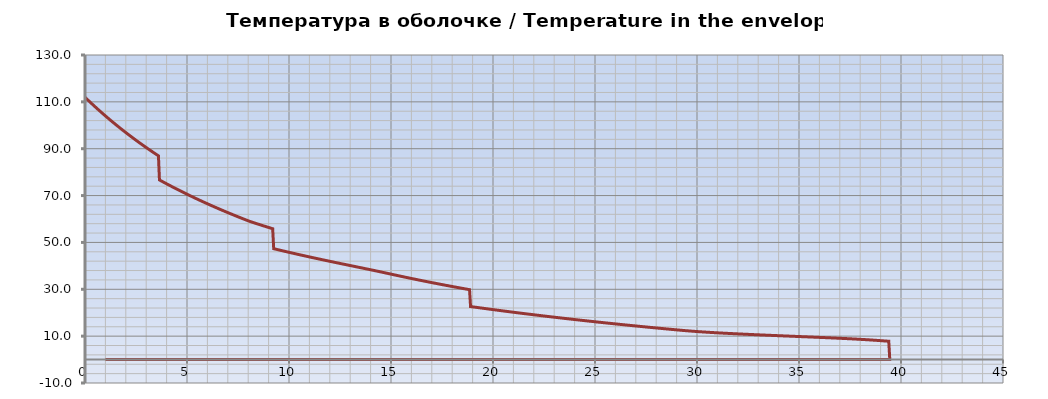
| Category | Температура в оболочке / Temperature in the envelope tв [C] |
|---|---|
| 0.0 | 111.962 |
| 0.05 | 111.542 |
| 0.1 | 111.124 |
| 0.15000000000000002 | 110.708 |
| 0.2 | 110.295 |
| 0.25 | 109.885 |
| 0.3 | 109.477 |
| 0.35 | 109.071 |
| 0.39999999999999997 | 108.668 |
| 0.44999999999999996 | 108.267 |
| 0.49999999999999994 | 107.868 |
| 0.5499999999999999 | 107.472 |
| 0.6 | 107.078 |
| 0.65 | 106.686 |
| 0.7000000000000001 | 106.297 |
| 0.7500000000000001 | 105.91 |
| 0.8000000000000002 | 105.525 |
| 0.8500000000000002 | 105.142 |
| 0.9000000000000002 | 104.761 |
| 0.9500000000000003 | 104.382 |
| 1.0000000000000002 | 104.006 |
| 1.0500000000000003 | 103.632 |
| 1.1000000000000003 | 103.26 |
| 1.1500000000000004 | 102.889 |
| 1.2000000000000004 | 102.521 |
| 1.2500000000000004 | 102.155 |
| 1.3000000000000005 | 101.791 |
| 1.3500000000000005 | 101.429 |
| 1.4000000000000006 | 101.069 |
| 1.4500000000000006 | 100.711 |
| 1.5000000000000007 | 100.355 |
| 1.5500000000000007 | 100.001 |
| 1.6000000000000008 | 99.649 |
| 1.6500000000000008 | 99.299 |
| 1.7000000000000008 | 98.95 |
| 1.7500000000000009 | 98.604 |
| 1.800000000000001 | 98.259 |
| 1.850000000000001 | 97.916 |
| 1.900000000000001 | 97.575 |
| 1.950000000000001 | 97.236 |
| 2.000000000000001 | 96.899 |
| 2.0500000000000007 | 96.563 |
| 2.1000000000000005 | 96.229 |
| 2.1500000000000004 | 95.897 |
| 2.2 | 95.567 |
| 2.25 | 95.238 |
| 2.3 | 94.911 |
| 2.3499999999999996 | 94.586 |
| 2.3999999999999995 | 94.262 |
| 2.4499999999999993 | 93.941 |
| 2.499999999999999 | 93.62 |
| 2.549999999999999 | 93.302 |
| 2.5999999999999988 | 92.985 |
| 2.6499999999999986 | 92.67 |
| 2.6999999999999984 | 92.356 |
| 2.7499999999999982 | 92.044 |
| 2.799999999999998 | 91.733 |
| 2.849999999999998 | 91.424 |
| 2.8999999999999977 | 91.117 |
| 2.9499999999999975 | 90.811 |
| 2.9999999999999973 | 90.507 |
| 3.049999999999997 | 90.204 |
| 3.099999999999997 | 89.903 |
| 3.149999999999997 | 89.603 |
| 3.1999999999999966 | 89.304 |
| 3.2499999999999964 | 89.008 |
| 3.2999999999999963 | 88.712 |
| 3.349999999999996 | 88.418 |
| 3.399999999999996 | 88.126 |
| 3.4499999999999957 | 87.835 |
| 3.4999999999999956 | 87.545 |
| 3.5499999999999954 | 87.257 |
| 3.599999999999995 | 86.97 |
| 3.649999999999995 | 76.668 |
| 3.699999999999995 | 76.43 |
| 3.7499999999999947 | 76.193 |
| 3.7999999999999945 | 75.957 |
| 3.8499999999999943 | 75.722 |
| 3.899999999999994 | 75.488 |
| 3.949999999999994 | 75.255 |
| 3.999999999999994 | 75.024 |
| 4.049999999999994 | 74.793 |
| 4.099999999999993 | 74.563 |
| 4.149999999999993 | 74.334 |
| 4.199999999999993 | 74.106 |
| 4.249999999999993 | 73.879 |
| 4.299999999999993 | 73.653 |
| 4.3499999999999925 | 73.428 |
| 4.399999999999992 | 73.204 |
| 4.449999999999992 | 72.981 |
| 4.499999999999992 | 72.758 |
| 4.549999999999992 | 72.537 |
| 4.599999999999992 | 72.317 |
| 4.6499999999999915 | 72.097 |
| 4.699999999999991 | 71.879 |
| 4.749999999999991 | 71.661 |
| 4.799999999999991 | 71.445 |
| 4.849999999999991 | 71.229 |
| 4.899999999999991 | 71.014 |
| 4.94999999999999 | 70.8 |
| 4.99999999999999 | 70.587 |
| 5.04999999999999 | 70.375 |
| 5.09999999999999 | 70.164 |
| 5.14999999999999 | 69.953 |
| 5.1999999999999895 | 69.743 |
| 5.249999999999989 | 69.535 |
| 5.299999999999989 | 69.327 |
| 5.349999999999989 | 69.12 |
| 5.399999999999989 | 68.914 |
| 5.449999999999989 | 68.708 |
| 5.4999999999999885 | 68.504 |
| 5.549999999999988 | 68.3 |
| 5.599999999999988 | 68.097 |
| 5.649999999999988 | 67.895 |
| 5.699999999999988 | 67.694 |
| 5.749999999999988 | 67.493 |
| 5.799999999999987 | 67.294 |
| 5.849999999999987 | 67.095 |
| 5.899999999999987 | 66.897 |
| 5.949999999999987 | 66.699 |
| 5.999999999999987 | 66.503 |
| 6.0499999999999865 | 66.307 |
| 6.099999999999986 | 66.112 |
| 6.149999999999986 | 65.918 |
| 6.199999999999986 | 65.724 |
| 6.249999999999986 | 65.532 |
| 6.299999999999986 | 65.34 |
| 6.349999999999985 | 65.149 |
| 6.399999999999985 | 64.958 |
| 6.449999999999985 | 64.769 |
| 6.499999999999985 | 64.58 |
| 6.549999999999985 | 64.391 |
| 6.5999999999999845 | 64.204 |
| 6.649999999999984 | 64.017 |
| 6.699999999999984 | 63.831 |
| 6.749999999999984 | 63.646 |
| 6.799999999999984 | 63.461 |
| 6.849999999999984 | 63.277 |
| 6.8999999999999835 | 63.094 |
| 6.949999999999983 | 62.912 |
| 6.999999999999983 | 62.73 |
| 7.049999999999983 | 62.549 |
| 7.099999999999983 | 62.368 |
| 7.149999999999983 | 62.188 |
| 7.199999999999982 | 62.009 |
| 7.249999999999982 | 61.831 |
| 7.299999999999982 | 61.653 |
| 7.349999999999982 | 61.476 |
| 7.399999999999982 | 61.3 |
| 7.4499999999999815 | 61.124 |
| 7.499999999999981 | 60.949 |
| 7.549999999999981 | 60.775 |
| 7.599999999999981 | 60.601 |
| 7.649999999999981 | 60.428 |
| 7.699999999999981 | 60.255 |
| 7.7499999999999805 | 60.083 |
| 7.79999999999998 | 59.912 |
| 7.84999999999998 | 59.741 |
| 7.89999999999998 | 59.571 |
| 7.94999999999998 | 59.402 |
| 7.99999999999998 | 59.233 |
| 8.04999999999998 | 59.065 |
| 8.09999999999998 | 58.919 |
| 8.14999999999998 | 58.774 |
| 8.199999999999982 | 58.629 |
| 8.249999999999982 | 58.485 |
| 8.299999999999983 | 58.342 |
| 8.349999999999984 | 58.199 |
| 8.399999999999984 | 58.056 |
| 8.449999999999985 | 57.915 |
| 8.499999999999986 | 57.774 |
| 8.549999999999986 | 57.633 |
| 8.599999999999987 | 57.493 |
| 8.649999999999988 | 57.354 |
| 8.699999999999989 | 57.215 |
| 8.74999999999999 | 57.076 |
| 8.79999999999999 | 56.938 |
| 8.84999999999999 | 56.801 |
| 8.899999999999991 | 56.664 |
| 8.949999999999992 | 56.528 |
| 8.999999999999993 | 56.393 |
| 9.049999999999994 | 56.257 |
| 9.099999999999994 | 56.123 |
| 9.149999999999995 | 55.988 |
| 9.199999999999996 | 55.855 |
| 9.249999999999996 | 47.335 |
| 9.299999999999997 | 47.23 |
| 9.349999999999998 | 47.124 |
| 9.399999999999999 | 47.019 |
| 9.45 | 46.914 |
| 9.5 | 46.81 |
| 9.55 | 46.706 |
| 9.600000000000001 | 46.602 |
| 9.650000000000002 | 46.499 |
| 9.700000000000003 | 46.396 |
| 9.750000000000004 | 46.293 |
| 9.800000000000004 | 46.19 |
| 9.850000000000005 | 46.088 |
| 9.900000000000006 | 45.986 |
| 9.950000000000006 | 45.885 |
| 10.000000000000007 | 45.784 |
| 10.050000000000008 | 45.683 |
| 10.100000000000009 | 45.582 |
| 10.15000000000001 | 45.482 |
| 10.20000000000001 | 45.382 |
| 10.25000000000001 | 45.282 |
| 10.300000000000011 | 45.183 |
| 10.350000000000012 | 45.084 |
| 10.400000000000013 | 44.985 |
| 10.450000000000014 | 44.886 |
| 10.500000000000014 | 44.788 |
| 10.550000000000015 | 44.69 |
| 10.600000000000016 | 44.592 |
| 10.650000000000016 | 44.495 |
| 10.700000000000017 | 44.397 |
| 10.750000000000018 | 44.3 |
| 10.800000000000018 | 44.204 |
| 10.85000000000002 | 44.107 |
| 10.90000000000002 | 44.011 |
| 10.95000000000002 | 43.915 |
| 11.000000000000021 | 43.819 |
| 11.050000000000022 | 43.724 |
| 11.100000000000023 | 43.628 |
| 11.150000000000023 | 43.533 |
| 11.200000000000024 | 43.438 |
| 11.250000000000025 | 43.344 |
| 11.300000000000026 | 43.249 |
| 11.350000000000026 | 43.155 |
| 11.400000000000027 | 43.061 |
| 11.450000000000028 | 42.967 |
| 11.500000000000028 | 42.874 |
| 11.55000000000003 | 42.78 |
| 11.60000000000003 | 42.687 |
| 11.65000000000003 | 42.594 |
| 11.700000000000031 | 42.501 |
| 11.750000000000032 | 42.409 |
| 11.800000000000033 | 42.316 |
| 11.850000000000033 | 42.224 |
| 11.900000000000034 | 42.132 |
| 11.950000000000035 | 42.04 |
| 12.000000000000036 | 41.948 |
| 12.050000000000036 | 41.856 |
| 12.100000000000037 | 41.765 |
| 12.150000000000038 | 41.674 |
| 12.200000000000038 | 41.582 |
| 12.250000000000039 | 41.491 |
| 12.30000000000004 | 41.4 |
| 12.35000000000004 | 41.31 |
| 12.400000000000041 | 41.219 |
| 12.450000000000042 | 41.128 |
| 12.500000000000043 | 41.038 |
| 12.550000000000043 | 40.948 |
| 12.600000000000044 | 40.857 |
| 12.650000000000045 | 40.767 |
| 12.700000000000045 | 40.677 |
| 12.750000000000046 | 40.587 |
| 12.800000000000047 | 40.497 |
| 12.850000000000048 | 40.407 |
| 12.900000000000048 | 40.317 |
| 12.950000000000049 | 40.228 |
| 13.00000000000005 | 40.138 |
| 13.05000000000005 | 40.048 |
| 13.100000000000051 | 39.959 |
| 13.150000000000052 | 39.869 |
| 13.200000000000053 | 39.779 |
| 13.250000000000053 | 39.69 |
| 13.300000000000054 | 39.6 |
| 13.350000000000055 | 39.51 |
| 13.400000000000055 | 39.421 |
| 13.450000000000056 | 39.331 |
| 13.500000000000057 | 39.241 |
| 13.550000000000058 | 39.151 |
| 13.600000000000058 | 39.062 |
| 13.650000000000059 | 38.972 |
| 13.70000000000006 | 38.882 |
| 13.75000000000006 | 38.791 |
| 13.800000000000061 | 38.701 |
| 13.850000000000062 | 38.611 |
| 13.900000000000063 | 38.52 |
| 13.950000000000063 | 38.429 |
| 14.000000000000064 | 38.338 |
| 14.050000000000065 | 38.247 |
| 14.100000000000065 | 38.156 |
| 14.150000000000066 | 38.064 |
| 14.200000000000067 | 37.973 |
| 14.250000000000068 | 37.881 |
| 14.300000000000068 | 37.788 |
| 14.350000000000069 | 37.696 |
| 14.40000000000007 | 37.603 |
| 14.45000000000007 | 37.51 |
| 14.500000000000071 | 37.416 |
| 14.550000000000072 | 37.323 |
| 14.600000000000072 | 37.229 |
| 14.650000000000073 | 37.134 |
| 14.700000000000074 | 37.04 |
| 14.750000000000075 | 36.945 |
| 14.800000000000075 | 36.85 |
| 14.850000000000076 | 36.754 |
| 14.900000000000077 | 36.659 |
| 14.950000000000077 | 36.564 |
| 15.000000000000078 | 36.469 |
| 15.050000000000079 | 36.373 |
| 15.10000000000008 | 36.278 |
| 15.15000000000008 | 36.184 |
| 15.200000000000081 | 36.089 |
| 15.250000000000082 | 35.995 |
| 15.300000000000082 | 35.901 |
| 15.350000000000083 | 35.808 |
| 15.400000000000084 | 35.714 |
| 15.450000000000085 | 35.621 |
| 15.500000000000085 | 35.528 |
| 15.550000000000086 | 35.436 |
| 15.600000000000087 | 35.343 |
| 15.650000000000087 | 35.251 |
| 15.700000000000088 | 35.159 |
| 15.750000000000089 | 35.068 |
| 15.80000000000009 | 34.976 |
| 15.85000000000009 | 34.885 |
| 15.900000000000091 | 34.794 |
| 15.950000000000092 | 34.704 |
| 16.000000000000092 | 34.613 |
| 16.050000000000093 | 34.523 |
| 16.100000000000094 | 34.433 |
| 16.150000000000095 | 34.344 |
| 16.200000000000095 | 34.254 |
| 16.250000000000096 | 34.165 |
| 16.300000000000097 | 34.076 |
| 16.350000000000097 | 33.987 |
| 16.400000000000098 | 33.899 |
| 16.4500000000001 | 33.811 |
| 16.5000000000001 | 33.723 |
| 16.5500000000001 | 33.635 |
| 16.6000000000001 | 33.548 |
| 16.6500000000001 | 33.46 |
| 16.700000000000102 | 33.373 |
| 16.750000000000103 | 33.286 |
| 16.800000000000104 | 33.2 |
| 16.850000000000104 | 33.113 |
| 16.900000000000105 | 33.027 |
| 16.950000000000106 | 32.941 |
| 17.000000000000107 | 32.856 |
| 17.050000000000107 | 32.77 |
| 17.100000000000108 | 32.685 |
| 17.15000000000011 | 32.6 |
| 17.20000000000011 | 32.515 |
| 17.25000000000011 | 32.431 |
| 17.30000000000011 | 32.346 |
| 17.35000000000011 | 32.262 |
| 17.400000000000112 | 32.178 |
| 17.450000000000113 | 32.095 |
| 17.500000000000114 | 32.011 |
| 17.550000000000114 | 31.928 |
| 17.600000000000115 | 31.845 |
| 17.650000000000116 | 31.762 |
| 17.700000000000117 | 31.679 |
| 17.750000000000117 | 31.597 |
| 17.800000000000118 | 31.515 |
| 17.85000000000012 | 31.433 |
| 17.90000000000012 | 31.351 |
| 17.95000000000012 | 31.27 |
| 18.00000000000012 | 31.188 |
| 18.05000000000012 | 31.107 |
| 18.100000000000122 | 31.026 |
| 18.150000000000123 | 30.946 |
| 18.200000000000124 | 30.865 |
| 18.250000000000124 | 30.785 |
| 18.300000000000125 | 30.705 |
| 18.350000000000126 | 30.625 |
| 18.400000000000126 | 30.545 |
| 18.450000000000127 | 30.466 |
| 18.500000000000128 | 30.386 |
| 18.55000000000013 | 30.307 |
| 18.60000000000013 | 30.228 |
| 18.65000000000013 | 30.15 |
| 18.70000000000013 | 30.071 |
| 18.75000000000013 | 29.993 |
| 18.800000000000132 | 29.915 |
| 18.850000000000133 | 29.837 |
| 18.900000000000134 | 22.631 |
| 18.950000000000134 | 22.571 |
| 19.000000000000135 | 22.51 |
| 19.050000000000136 | 22.45 |
| 19.100000000000136 | 22.39 |
| 19.150000000000137 | 22.33 |
| 19.200000000000138 | 22.27 |
| 19.25000000000014 | 22.21 |
| 19.30000000000014 | 22.151 |
| 19.35000000000014 | 22.091 |
| 19.40000000000014 | 22.032 |
| 19.45000000000014 | 21.973 |
| 19.500000000000142 | 21.914 |
| 19.550000000000143 | 21.855 |
| 19.600000000000144 | 21.796 |
| 19.650000000000144 | 21.738 |
| 19.700000000000145 | 21.679 |
| 19.750000000000146 | 21.621 |
| 19.800000000000146 | 21.562 |
| 19.850000000000147 | 21.504 |
| 19.900000000000148 | 21.446 |
| 19.95000000000015 | 21.388 |
| 20.00000000000015 | 21.331 |
| 20.05000000000015 | 21.273 |
| 20.10000000000015 | 21.216 |
| 20.15000000000015 | 21.158 |
| 20.200000000000152 | 21.101 |
| 20.250000000000153 | 21.044 |
| 20.300000000000153 | 20.987 |
| 20.350000000000154 | 20.93 |
| 20.400000000000155 | 20.873 |
| 20.450000000000156 | 20.817 |
| 20.500000000000156 | 20.76 |
| 20.550000000000157 | 20.704 |
| 20.600000000000158 | 20.648 |
| 20.65000000000016 | 20.592 |
| 20.70000000000016 | 20.536 |
| 20.75000000000016 | 20.48 |
| 20.80000000000016 | 20.424 |
| 20.85000000000016 | 20.368 |
| 20.900000000000162 | 20.313 |
| 20.950000000000163 | 20.258 |
| 21.000000000000163 | 20.202 |
| 21.050000000000164 | 20.147 |
| 21.100000000000165 | 20.092 |
| 21.150000000000166 | 20.037 |
| 21.200000000000166 | 19.982 |
| 21.250000000000167 | 19.928 |
| 21.300000000000168 | 19.873 |
| 21.35000000000017 | 19.819 |
| 21.40000000000017 | 19.764 |
| 21.45000000000017 | 19.71 |
| 21.50000000000017 | 19.656 |
| 21.55000000000017 | 19.602 |
| 21.600000000000172 | 19.548 |
| 21.650000000000173 | 19.495 |
| 21.700000000000173 | 19.441 |
| 21.750000000000174 | 19.387 |
| 21.800000000000175 | 19.334 |
| 21.850000000000176 | 19.281 |
| 21.900000000000176 | 19.228 |
| 21.950000000000177 | 19.175 |
| 22.000000000000178 | 19.122 |
| 22.05000000000018 | 19.069 |
| 22.10000000000018 | 19.016 |
| 22.15000000000018 | 18.963 |
| 22.20000000000018 | 18.911 |
| 22.25000000000018 | 18.859 |
| 22.300000000000182 | 18.806 |
| 22.350000000000183 | 18.754 |
| 22.400000000000183 | 18.702 |
| 22.450000000000184 | 18.65 |
| 22.500000000000185 | 18.598 |
| 22.550000000000185 | 18.547 |
| 22.600000000000186 | 18.495 |
| 22.650000000000187 | 18.444 |
| 22.700000000000188 | 18.392 |
| 22.75000000000019 | 18.341 |
| 22.80000000000019 | 18.29 |
| 22.85000000000019 | 18.239 |
| 22.90000000000019 | 18.188 |
| 22.95000000000019 | 18.137 |
| 23.000000000000192 | 18.086 |
| 23.050000000000193 | 18.035 |
| 23.100000000000193 | 17.985 |
| 23.150000000000194 | 17.934 |
| 23.200000000000195 | 17.884 |
| 23.250000000000195 | 17.834 |
| 23.300000000000196 | 17.784 |
| 23.350000000000197 | 17.734 |
| 23.400000000000198 | 17.684 |
| 23.4500000000002 | 17.634 |
| 23.5000000000002 | 17.584 |
| 23.5500000000002 | 17.535 |
| 23.6000000000002 | 17.485 |
| 23.6500000000002 | 17.436 |
| 23.700000000000202 | 17.387 |
| 23.750000000000203 | 17.337 |
| 23.800000000000203 | 17.288 |
| 23.850000000000204 | 17.239 |
| 23.900000000000205 | 17.19 |
| 23.950000000000205 | 17.142 |
| 24.000000000000206 | 17.093 |
| 24.050000000000207 | 17.044 |
| 24.100000000000207 | 16.996 |
| 24.150000000000208 | 16.947 |
| 24.20000000000021 | 16.899 |
| 24.25000000000021 | 16.851 |
| 24.30000000000021 | 16.803 |
| 24.35000000000021 | 16.755 |
| 24.40000000000021 | 16.707 |
| 24.450000000000212 | 16.659 |
| 24.500000000000213 | 16.611 |
| 24.550000000000214 | 16.564 |
| 24.600000000000215 | 16.516 |
| 24.650000000000215 | 16.469 |
| 24.700000000000216 | 16.422 |
| 24.750000000000217 | 16.374 |
| 24.800000000000217 | 16.327 |
| 24.850000000000218 | 16.28 |
| 24.90000000000022 | 16.233 |
| 24.95000000000022 | 16.186 |
| 25.00000000000022 | 16.14 |
| 25.05000000000022 | 16.093 |
| 25.10000000000022 | 16.046 |
| 25.150000000000222 | 16 |
| 25.200000000000223 | 15.954 |
| 25.250000000000224 | 15.907 |
| 25.300000000000225 | 15.861 |
| 25.350000000000225 | 15.815 |
| 25.400000000000226 | 15.769 |
| 25.450000000000227 | 15.723 |
| 25.500000000000227 | 15.677 |
| 25.550000000000228 | 15.632 |
| 25.60000000000023 | 15.586 |
| 25.65000000000023 | 15.54 |
| 25.70000000000023 | 15.495 |
| 25.75000000000023 | 15.45 |
| 25.80000000000023 | 15.404 |
| 25.850000000000232 | 15.359 |
| 25.900000000000233 | 15.314 |
| 25.950000000000234 | 15.269 |
| 26.000000000000234 | 15.224 |
| 26.050000000000235 | 15.179 |
| 26.100000000000236 | 15.135 |
| 26.150000000000237 | 15.09 |
| 26.200000000000237 | 15.045 |
| 26.250000000000238 | 15.001 |
| 26.30000000000024 | 14.957 |
| 26.35000000000024 | 14.912 |
| 26.40000000000024 | 14.868 |
| 26.45000000000024 | 14.824 |
| 26.50000000000024 | 14.78 |
| 26.550000000000242 | 14.736 |
| 26.600000000000243 | 14.692 |
| 26.650000000000244 | 14.648 |
| 26.700000000000244 | 14.605 |
| 26.750000000000245 | 14.561 |
| 26.800000000000246 | 14.518 |
| 26.850000000000247 | 14.474 |
| 26.900000000000247 | 14.431 |
| 26.950000000000248 | 14.388 |
| 27.00000000000025 | 14.344 |
| 27.05000000000025 | 14.301 |
| 27.10000000000025 | 14.258 |
| 27.15000000000025 | 14.215 |
| 27.20000000000025 | 14.173 |
| 27.250000000000252 | 14.13 |
| 27.300000000000253 | 14.087 |
| 27.350000000000254 | 14.045 |
| 27.400000000000254 | 14.002 |
| 27.450000000000255 | 13.96 |
| 27.500000000000256 | 13.917 |
| 27.550000000000257 | 13.875 |
| 27.600000000000257 | 13.833 |
| 27.650000000000258 | 13.791 |
| 27.70000000000026 | 13.749 |
| 27.75000000000026 | 13.707 |
| 27.80000000000026 | 13.665 |
| 27.85000000000026 | 13.623 |
| 27.90000000000026 | 13.582 |
| 27.950000000000262 | 13.54 |
| 28.000000000000263 | 13.498 |
| 28.050000000000264 | 13.457 |
| 28.100000000000264 | 13.416 |
| 28.150000000000265 | 13.374 |
| 28.200000000000266 | 13.333 |
| 28.250000000000266 | 13.292 |
| 28.300000000000267 | 13.251 |
| 28.350000000000268 | 13.21 |
| 28.40000000000027 | 13.169 |
| 28.45000000000027 | 13.128 |
| 28.50000000000027 | 13.087 |
| 28.55000000000027 | 13.047 |
| 28.60000000000027 | 13.006 |
| 28.650000000000272 | 12.966 |
| 28.700000000000273 | 12.925 |
| 28.750000000000274 | 12.885 |
| 28.800000000000274 | 12.845 |
| 28.850000000000275 | 12.804 |
| 28.900000000000276 | 12.764 |
| 28.950000000000276 | 12.724 |
| 29.000000000000277 | 12.684 |
| 29.050000000000278 | 12.644 |
| 29.10000000000028 | 12.605 |
| 29.15000000000028 | 12.565 |
| 29.20000000000028 | 12.526 |
| 29.25000000000028 | 12.487 |
| 29.30000000000028 | 12.449 |
| 29.350000000000282 | 12.411 |
| 29.400000000000283 | 12.374 |
| 29.450000000000284 | 12.337 |
| 29.500000000000284 | 12.301 |
| 29.550000000000285 | 12.265 |
| 29.600000000000286 | 12.23 |
| 29.650000000000286 | 12.195 |
| 29.700000000000287 | 12.161 |
| 29.750000000000288 | 12.128 |
| 29.80000000000029 | 12.095 |
| 29.85000000000029 | 12.062 |
| 29.90000000000029 | 12.03 |
| 29.95000000000029 | 11.998 |
| 30.00000000000029 | 11.967 |
| 30.050000000000292 | 11.936 |
| 30.100000000000293 | 11.906 |
| 30.150000000000293 | 11.876 |
| 30.200000000000294 | 11.847 |
| 30.250000000000295 | 11.818 |
| 30.300000000000296 | 11.789 |
| 30.350000000000296 | 11.761 |
| 30.400000000000297 | 11.732 |
| 30.450000000000298 | 11.705 |
| 30.5000000000003 | 11.677 |
| 30.5500000000003 | 11.65 |
| 30.6000000000003 | 11.624 |
| 30.6500000000003 | 11.597 |
| 30.7000000000003 | 11.571 |
| 30.750000000000302 | 11.545 |
| 30.800000000000303 | 11.52 |
| 30.850000000000303 | 11.494 |
| 30.900000000000304 | 11.469 |
| 30.950000000000305 | 11.444 |
| 31.000000000000306 | 11.42 |
| 31.050000000000306 | 11.395 |
| 31.100000000000307 | 11.371 |
| 31.150000000000308 | 11.347 |
| 31.20000000000031 | 11.323 |
| 31.25000000000031 | 11.3 |
| 31.30000000000031 | 11.276 |
| 31.35000000000031 | 11.253 |
| 31.40000000000031 | 11.23 |
| 31.450000000000312 | 11.207 |
| 31.500000000000313 | 11.185 |
| 31.550000000000313 | 11.162 |
| 31.600000000000314 | 11.14 |
| 31.650000000000315 | 11.118 |
| 31.700000000000315 | 11.096 |
| 31.750000000000316 | 11.074 |
| 31.800000000000317 | 11.052 |
| 31.850000000000318 | 11.031 |
| 31.90000000000032 | 11.009 |
| 31.95000000000032 | 10.988 |
| 32.00000000000032 | 10.967 |
| 32.05000000000032 | 10.946 |
| 32.100000000000314 | 10.925 |
| 32.15000000000031 | 10.904 |
| 32.20000000000031 | 10.884 |
| 32.250000000000306 | 10.863 |
| 32.3000000000003 | 10.843 |
| 32.3500000000003 | 10.822 |
| 32.4000000000003 | 10.802 |
| 32.450000000000294 | 10.782 |
| 32.50000000000029 | 10.762 |
| 32.55000000000029 | 10.742 |
| 32.600000000000286 | 10.722 |
| 32.65000000000028 | 10.702 |
| 32.70000000000028 | 10.683 |
| 32.75000000000028 | 10.663 |
| 32.800000000000274 | 10.643 |
| 32.85000000000027 | 10.624 |
| 32.90000000000027 | 10.605 |
| 32.950000000000266 | 10.585 |
| 33.00000000000026 | 10.566 |
| 33.05000000000026 | 10.547 |
| 33.10000000000026 | 10.528 |
| 33.150000000000254 | 10.509 |
| 33.20000000000025 | 10.49 |
| 33.25000000000025 | 10.471 |
| 33.300000000000246 | 10.452 |
| 33.35000000000024 | 10.434 |
| 33.40000000000024 | 10.415 |
| 33.45000000000024 | 10.396 |
| 33.500000000000234 | 10.378 |
| 33.55000000000023 | 10.359 |
| 33.60000000000023 | 10.341 |
| 33.650000000000226 | 10.322 |
| 33.70000000000022 | 10.304 |
| 33.75000000000022 | 10.285 |
| 33.80000000000022 | 10.267 |
| 33.850000000000215 | 10.249 |
| 33.90000000000021 | 10.23 |
| 33.95000000000021 | 10.212 |
| 34.000000000000206 | 10.194 |
| 34.0500000000002 | 10.176 |
| 34.1000000000002 | 10.158 |
| 34.1500000000002 | 10.14 |
| 34.200000000000195 | 10.122 |
| 34.25000000000019 | 10.104 |
| 34.30000000000019 | 10.086 |
| 34.350000000000186 | 10.068 |
| 34.40000000000018 | 10.05 |
| 34.45000000000018 | 10.032 |
| 34.50000000000018 | 10.014 |
| 34.550000000000175 | 9.996 |
| 34.60000000000017 | 9.978 |
| 34.65000000000017 | 9.96 |
| 34.700000000000166 | 9.942 |
| 34.75000000000016 | 9.924 |
| 34.80000000000016 | 9.906 |
| 34.85000000000016 | 9.888 |
| 34.900000000000155 | 9.87 |
| 34.95000000000015 | 9.852 |
| 35.00000000000015 | 9.835 |
| 35.050000000000146 | 9.817 |
| 35.10000000000014 | 9.799 |
| 35.15000000000014 | 9.781 |
| 35.20000000000014 | 9.763 |
| 35.250000000000135 | 9.745 |
| 35.30000000000013 | 9.727 |
| 35.35000000000013 | 9.709 |
| 35.40000000000013 | 9.691 |
| 35.450000000000124 | 9.673 |
| 35.50000000000012 | 9.655 |
| 35.55000000000012 | 9.637 |
| 35.600000000000115 | 9.619 |
| 35.65000000000011 | 9.601 |
| 35.70000000000011 | 9.582 |
| 35.75000000000011 | 9.564 |
| 35.800000000000104 | 9.546 |
| 35.8500000000001 | 9.528 |
| 35.9000000000001 | 9.509 |
| 35.950000000000095 | 9.491 |
| 36.00000000000009 | 9.472 |
| 36.05000000000009 | 9.454 |
| 36.10000000000009 | 9.435 |
| 36.150000000000084 | 9.417 |
| 36.20000000000008 | 9.398 |
| 36.25000000000008 | 9.379 |
| 36.300000000000075 | 9.361 |
| 36.35000000000007 | 9.342 |
| 36.40000000000007 | 9.323 |
| 36.45000000000007 | 9.304 |
| 36.500000000000064 | 9.284 |
| 36.55000000000006 | 9.265 |
| 36.60000000000006 | 9.246 |
| 36.650000000000055 | 9.226 |
| 36.70000000000005 | 9.207 |
| 36.75000000000005 | 9.187 |
| 36.80000000000005 | 9.168 |
| 36.850000000000044 | 9.148 |
| 36.90000000000004 | 9.128 |
| 36.95000000000004 | 9.108 |
| 37.000000000000036 | 9.087 |
| 37.05000000000003 | 9.067 |
| 37.10000000000003 | 9.046 |
| 37.15000000000003 | 9.026 |
| 37.200000000000024 | 9.005 |
| 37.25000000000002 | 8.984 |
| 37.30000000000002 | 8.962 |
| 37.350000000000016 | 8.941 |
| 37.40000000000001 | 8.92 |
| 37.45000000000001 | 8.898 |
| 37.50000000000001 | 8.876 |
| 37.550000000000004 | 8.854 |
| 37.6 | 8.831 |
| 37.65 | 8.808 |
| 37.699999999999996 | 8.786 |
| 37.74999999999999 | 8.762 |
| 37.79999999999999 | 8.739 |
| 37.84999999999999 | 8.715 |
| 37.899999999999984 | 8.691 |
| 37.94999999999998 | 8.667 |
| 37.99999999999998 | 8.642 |
| 38.049999999999976 | 8.617 |
| 38.09999999999997 | 8.592 |
| 38.14999999999997 | 8.567 |
| 38.19999999999997 | 8.541 |
| 38.249999999999964 | 8.514 |
| 38.29999999999996 | 8.488 |
| 38.34999999999996 | 8.461 |
| 38.399999999999956 | 8.433 |
| 38.44999999999995 | 8.405 |
| 38.49999999999995 | 8.377 |
| 38.54999999999995 | 8.348 |
| 38.599999999999945 | 8.319 |
| 38.64999999999994 | 8.289 |
| 38.69999999999994 | 8.26 |
| 38.749999999999936 | 8.229 |
| 38.79999999999993 | 8.199 |
| 38.84999999999993 | 8.168 |
| 38.89999999999993 | 8.136 |
| 38.949999999999925 | 8.105 |
| 38.99999999999992 | 8.074 |
| 39.04999999999992 | 8.042 |
| 39.099999999999916 | 8.011 |
| 39.14999999999991 | 7.979 |
| 39.19999999999991 | 7.948 |
| 39.24999999999991 | 7.916 |
| 39.299999999999905 | 7.885 |
| 39.3499999999999 | 7.854 |
| 39.3999999999999 | 7.823 |
| 39.449999999999896 | 0 |
| 1.0 | 0 |
| 1.0 | 0 |
| 1.0 | 0 |
| 1.0 | 0 |
| 1.0 | 0 |
| 1.0 | 0 |
| 1.0 | 0 |
| 1.0 | 0 |
| 1.0 | 0 |
| 1.0 | 0 |
| 1.0 | 0 |
| 1.0 | 0 |
| 1.0 | 0 |
| 1.0 | 0 |
| 1.0 | 0 |
| 1.0 | 0 |
| 1.0 | 0 |
| 1.0 | 0 |
| 1.0 | 0 |
| 1.0 | 0 |
| 1.0 | 0 |
| 1.0 | 0 |
| 1.0 | 0 |
| 1.0 | 0 |
| 1.0 | 0 |
| 1.0 | 0 |
| 1.0 | 0 |
| 1.0 | 0 |
| 1.0 | 0 |
| 1.0 | 0 |
| 1.0 | 0 |
| 1.0 | 0 |
| 1.0 | 0 |
| 1.0 | 0 |
| 1.0 | 0 |
| 1.0 | 0 |
| 1.0 | 0 |
| 1.0 | 0 |
| 1.0 | 0 |
| 1.0 | 0 |
| 1.0 | 0 |
| 1.0 | 0 |
| 1.0 | 0 |
| 1.0 | 0 |
| 1.0 | 0 |
| 1.0 | 0 |
| 1.0 | 0 |
| 1.0 | 0 |
| 1.0 | 0 |
| 1.0 | 0 |
| 1.0 | 0 |
| 1.0 | 0 |
| 1.0 | 0 |
| 1.0 | 0 |
| 1.0 | 0 |
| 1.0 | 0 |
| 1.0 | 0 |
| 1.0 | 0 |
| 1.0 | 0 |
| 1.0 | 0 |
| 1.0 | 0 |
| 1.0 | 0 |
| 1.0 | 0 |
| 1.0 | 0 |
| 1.0 | 0 |
| 1.0 | 0 |
| 1.0 | 0 |
| 1.0 | 0 |
| 1.0 | 0 |
| 1.0 | 0 |
| 1.0 | 0 |
| 1.0 | 0 |
| 1.0 | 0 |
| 1.0 | 0 |
| 1.0 | 0 |
| 1.0 | 0 |
| 1.0 | 0 |
| 1.0 | 0 |
| 1.0 | 0 |
| 1.0 | 0 |
| 1.0 | 0 |
| 1.0 | 0 |
| 1.0 | 0 |
| 1.0 | 0 |
| 1.0 | 0 |
| 1.0 | 0 |
| 1.0 | 0 |
| 1.0 | 0 |
| 1.0 | 0 |
| 1.0 | 0 |
| 1.0 | 0 |
| 1.0 | 0 |
| 1.0 | 0 |
| 1.0 | 0 |
| 1.0 | 0 |
| 1.0 | 0 |
| 1.0 | 0 |
| 1.0 | 0 |
| 1.0 | 0 |
| 1.0 | 0 |
| 1.0 | 0 |
| 1.0 | 0 |
| 1.0 | 0 |
| 1.0 | 0 |
| 1.0 | 0 |
| 1.0 | 0 |
| 1.0 | 0 |
| 1.0 | 0 |
| 1.0 | 0 |
| 1.0 | 0 |
| 1.0 | 0 |
| 1.0 | 0 |
| 1.0 | 0 |
| 1.0 | 0 |
| 1.0 | 0 |
| 1.0 | 0 |
| 1.0 | 0 |
| 1.0 | 0 |
| 1.0 | 0 |
| 1.0 | 0 |
| 1.0 | 0 |
| 1.0 | 0 |
| 1.0 | 0 |
| 1.0 | 0 |
| 1.0 | 0 |
| 1.0 | 0 |
| 1.0 | 0 |
| 1.0 | 0 |
| 1.0 | 0 |
| 1.0 | 0 |
| 1.0 | 0 |
| 1.0 | 0 |
| 1.0 | 0 |
| 1.0 | 0 |
| 1.0 | 0 |
| 1.0 | 0 |
| 1.0 | 0 |
| 1.0 | 0 |
| 1.0 | 0 |
| 1.0 | 0 |
| 1.0 | 0 |
| 1.0 | 0 |
| 1.0 | 0 |
| 1.0 | 0 |
| 1.0 | 0 |
| 1.0 | 0 |
| 1.0 | 0 |
| 1.0 | 0 |
| 1.0 | 0 |
| 1.0 | 0 |
| 1.0 | 0 |
| 1.0 | 0 |
| 1.0 | 0 |
| 1.0 | 0 |
| 1.0 | 0 |
| 1.0 | 0 |
| 1.0 | 0 |
| 1.0 | 0 |
| 1.0 | 0 |
| 1.0 | 0 |
| 1.0 | 0 |
| 1.0 | 0 |
| 1.0 | 0 |
| 1.0 | 0 |
| 1.0 | 0 |
| 1.0 | 0 |
| 1.0 | 0 |
| 1.0 | 0 |
| 1.0 | 0 |
| 1.0 | 0 |
| 1.0 | 0 |
| 1.0 | 0 |
| 1.0 | 0 |
| 1.0 | 0 |
| 1.0 | 0 |
| 1.0 | 0 |
| 1.0 | 0 |
| 1.0 | 0 |
| 1.0 | 0 |
| 1.0 | 0 |
| 1.0 | 0 |
| 1.0 | 0 |
| 1.0 | 0 |
| 1.0 | 0 |
| 1.0 | 0 |
| 1.0 | 0 |
| 1.0 | 0 |
| 1.0 | 0 |
| 1.0 | 0 |
| 1.0 | 0 |
| 1.0 | 0 |
| 1.0 | 0 |
| 1.0 | 0 |
| 1.0 | 0 |
| 1.0 | 0 |
| 1.0 | 0 |
| 1.0 | 0 |
| 1.0 | 0 |
| 1.0 | 0 |
| 1.0 | 0 |
| 1.0 | 0 |
| 1.0 | 0 |
| 1.0 | 0 |
| 1.0 | 0 |
| 1.0 | 0 |
| 1.0 | 0 |
| 1.0 | 0 |
| 1.0 | 0 |
| 1.0 | 0 |
| 1.0 | 0 |
| 1.0 | 0 |
| 1.0 | 0 |
| 1.0 | 0 |
| 1.0 | 0 |
| 1.0 | 0 |
| 1.0 | 0 |
| 1.0 | 0 |
| 1.0 | 0 |
| 1.0 | 0 |
| 1.0 | 0 |
| 1.0 | 0 |
| 1.0 | 0 |
| 1.0 | 0 |
| 1.0 | 0 |
| 1.0 | 0 |
| 1.0 | 0 |
| 1.0 | 0 |
| 1.0 | 0 |
| 1.0 | 0 |
| 1.0 | 0 |
| 1.0 | 0 |
| 1.0 | 0 |
| 1.0 | 0 |
| 1.0 | 0 |
| 1.0 | 0 |
| 1.0 | 0 |
| 1.0 | 0 |
| 1.0 | 0 |
| 1.0 | 0 |
| 1.0 | 0 |
| 1.0 | 0 |
| 1.0 | 0 |
| 1.0 | 0 |
| 1.0 | 0 |
| 1.0 | 0 |
| 1.0 | 0 |
| 1.0 | 0 |
| 1.0 | 0 |
| 1.0 | 0 |
| 1.0 | 0 |
| 1.0 | 0 |
| 1.0 | 0 |
| 1.0 | 0 |
| 1.0 | 0 |
| 1.0 | 0 |
| 1.0 | 0 |
| 1.0 | 0 |
| 1.0 | 0 |
| 1.0 | 0 |
| 1.0 | 0 |
| 1.0 | 0 |
| 1.0 | 0 |
| 1.0 | 0 |
| 1.0 | 0 |
| 1.0 | 0 |
| 1.0 | 0 |
| 1.0 | 0 |
| 1.0 | 0 |
| 1.0 | 0 |
| 1.0 | 0 |
| 1.0 | 0 |
| 1.0 | 0 |
| 1.0 | 0 |
| 1.0 | 0 |
| 1.0 | 0 |
| 1.0 | 0 |
| 1.0 | 0 |
| 1.0 | 0 |
| 1.0 | 0 |
| 1.0 | 0 |
| 1.0 | 0 |
| 1.0 | 0 |
| 1.0 | 0 |
| 1.0 | 0 |
| 1.0 | 0 |
| 1.0 | 0 |
| 1.0 | 0 |
| 1.0 | 0 |
| 1.0 | 0 |
| 1.0 | 0 |
| 1.0 | 0 |
| 1.0 | 0 |
| 1.0 | 0 |
| 1.0 | 0 |
| 1.0 | 0 |
| 1.0 | 0 |
| 1.0 | 0 |
| 1.0 | 0 |
| 1.0 | 0 |
| 1.0 | 0 |
| 1.0 | 0 |
| 1.0 | 0 |
| 1.0 | 0 |
| 1.0 | 0 |
| 1.0 | 0 |
| 1.0 | 0 |
| 1.0 | 0 |
| 1.0 | 0 |
| 1.0 | 0 |
| 1.0 | 0 |
| 1.0 | 0 |
| 1.0 | 0 |
| 1.0 | 0 |
| 1.0 | 0 |
| 1.0 | 0 |
| 1.0 | 0 |
| 1.0 | 0 |
| 1.0 | 0 |
| 1.0 | 0 |
| 1.0 | 0 |
| 1.0 | 0 |
| 1.0 | 0 |
| 1.0 | 0 |
| 1.0 | 0 |
| 1.0 | 0 |
| 1.0 | 0 |
| 1.0 | 0 |
| 1.0 | 0 |
| 1.0 | 0 |
| 1.0 | 0 |
| 1.0 | 0 |
| 1.0 | 0 |
| 1.0 | 0 |
| 1.0 | 0 |
| 1.0 | 0 |
| 1.0 | 0 |
| 1.0 | 0 |
| 1.0 | 0 |
| 1.0 | 0 |
| 1.0 | 0 |
| 1.0 | 0 |
| 1.0 | 0 |
| 1.0 | 0 |
| 1.0 | 0 |
| 1.0 | 0 |
| 1.0 | 0 |
| 1.0 | 0 |
| 1.0 | 0 |
| 1.0 | 0 |
| 1.0 | 0 |
| 1.0 | 0 |
| 1.0 | 0 |
| 1.0 | 0 |
| 1.0 | 0 |
| 1.0 | 0 |
| 1.0 | 0 |
| 1.0 | 0 |
| 1.0 | 0 |
| 1.0 | 0 |
| 1.0 | 0 |
| 1.0 | 0 |
| 1.0 | 0 |
| 1.0 | 0 |
| 1.0 | 0 |
| 1.0 | 0 |
| 1.0 | 0 |
| 1.0 | 0 |
| 1.0 | 0 |
| 1.0 | 0 |
| 1.0 | 0 |
| 1.0 | 0 |
| 1.0 | 0 |
| 1.0 | 0 |
| 1.0 | 0 |
| 1.0 | 0 |
| 1.0 | 0 |
| 1.0 | 0 |
| 1.0 | 0 |
| 1.0 | 0 |
| 1.0 | 0 |
| 1.0 | 0 |
| 1.0 | 0 |
| 1.0 | 0 |
| 1.0 | 0 |
| 1.0 | 0 |
| 1.0 | 0 |
| 1.0 | 0 |
| 1.0 | 0 |
| 1.0 | 0 |
| 1.0 | 0 |
| 1.0 | 0 |
| 1.0 | 0 |
| 1.0 | 0 |
| 1.0 | 0 |
| 1.0 | 0 |
| 1.0 | 0 |
| 1.0 | 0 |
| 1.0 | 0 |
| 1.0 | 0 |
| 1.0 | 0 |
| 1.0 | 0 |
| 1.0 | 0 |
| 1.0 | 0 |
| 1.0 | 0 |
| 1.0 | 0 |
| 1.0 | 0 |
| 1.0 | 0 |
| 1.0 | 0 |
| 1.0 | 0 |
| 1.0 | 0 |
| 1.0 | 0 |
| 1.0 | 0 |
| 1.0 | 0 |
| 1.0 | 0 |
| 1.0 | 0 |
| 1.0 | 0 |
| 1.0 | 0 |
| 1.0 | 0 |
| 1.0 | 0 |
| 1.0 | 0 |
| 1.0 | 0 |
| 1.0 | 0 |
| 1.0 | 0 |
| 1.0 | 0 |
| 1.0 | 0 |
| 1.0 | 0 |
| 1.0 | 0 |
| 1.0 | 0 |
| 1.0 | 0 |
| 1.0 | 0 |
| 1.0 | 0 |
| 1.0 | 0 |
| 1.0 | 0 |
| 1.0 | 0 |
| 1.0 | 0 |
| 1.0 | 0 |
| 1.0 | 0 |
| 1.0 | 0 |
| 1.0 | 0 |
| 1.0 | 0 |
| 1.0 | 0 |
| 1.0 | 0 |
| 1.0 | 0 |
| 1.0 | 0 |
| 1.0 | 0 |
| 1.0 | 0 |
| 1.0 | 0 |
| 1.0 | 0 |
| 1.0 | 0 |
| 1.0 | 0 |
| 1.0 | 0 |
| 1.0 | 0 |
| 1.0 | 0 |
| 1.0 | 0 |
| 1.0 | 0 |
| 1.0 | 0 |
| 1.0 | 0 |
| 1.0 | 0 |
| 1.0 | 0 |
| 1.0 | 0 |
| 1.0 | 0 |
| 1.0 | 0 |
| 1.0 | 0 |
| 1.0 | 0 |
| 1.0 | 0 |
| 1.0 | 0 |
| 1.0 | 0 |
| 1.0 | 0 |
| 1.0 | 0 |
| 1.0 | 0 |
| 1.0 | 0 |
| 1.0 | 0 |
| 1.0 | 0 |
| 1.0 | 0 |
| 1.0 | 0 |
| 1.0 | 0 |
| 1.0 | 0 |
| 1.0 | 0 |
| 1.0 | 0 |
| 1.0 | 0 |
| 1.0 | 0 |
| 1.0 | 0 |
| 1.0 | 0 |
| 1.0 | 0 |
| 1.0 | 0 |
| 1.0 | 0 |
| 1.0 | 0 |
| 1.0 | 0 |
| 1.0 | 0 |
| 1.0 | 0 |
| 1.0 | 0 |
| 1.0 | 0 |
| 1.0 | 0 |
| 1.0 | 0 |
| 1.0 | 0 |
| 1.0 | 0 |
| 1.0 | 0 |
| 1.0 | 0 |
| 1.0 | 0 |
| 1.0 | 0 |
| 1.0 | 0 |
| 1.0 | 0 |
| 1.0 | 0 |
| 1.0 | 0 |
| 1.0 | 0 |
| 1.0 | 0 |
| 1.0 | 0 |
| 1.0 | 0 |
| 1.0 | 0 |
| 1.0 | 0 |
| 1.0 | 0 |